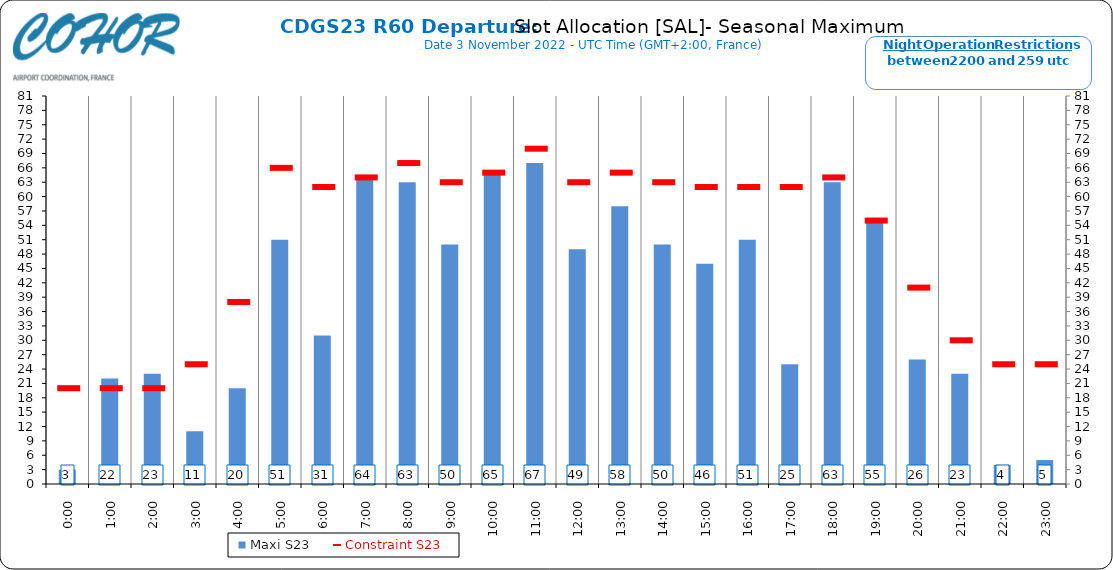
| Category | Maxi S23 |
|---|---|
| 0:00 | 3 |
| 1:00 | 22 |
| 2:00 | 23 |
| 3:00 | 11 |
| 4:00 | 20 |
| 5:00 | 51 |
| 6:00 | 31 |
| 7:00 | 64 |
| 8:00 | 63 |
| 9:00 | 50 |
| 10:00 | 65 |
| 11:00 | 67 |
| 12:00 | 49 |
| 13:00 | 58 |
| 14:00 | 50 |
| 15:00 | 46 |
| 16:00 | 51 |
| 17:00 | 25 |
| 18:00 | 63 |
| 19:00 | 55 |
| 20:00 | 26 |
| 21:00 | 23 |
| 22:00 | 4 |
| 23:00 | 5 |